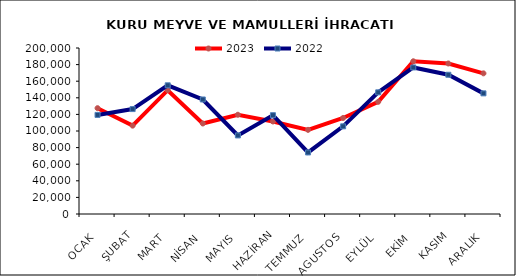
| Category | 2023 | 2022 |
|---|---|---|
| OCAK | 127494.399 | 119385.471 |
| ŞUBAT | 106463.873 | 126400.264 |
| MART | 149170.63 | 155057.611 |
| NİSAN | 109047.513 | 137975.163 |
| MAYIS | 119577.462 | 94664.838 |
| HAZİRAN | 111482.294 | 119035.467 |
| TEMMUZ | 101380.235 | 74147.694 |
| AGUSTOS | 115709.608 | 105628.142 |
| EYLÜL | 135179.167 | 146579.949 |
| EKİM | 184000.516 | 176556.86 |
| KASIM | 181337.863 | 167762.547 |
| ARALIK | 169460.512 | 145344.918 |